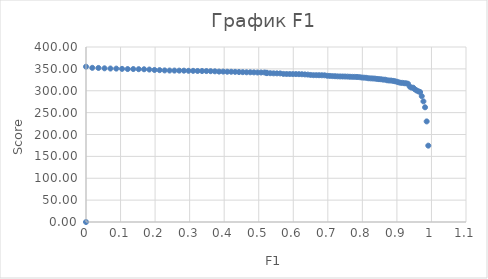
| Category | Column 3 |
|---|---|
| 0.0 | 0 |
| 0.0 | 355 |
| 0.01818181818181818 | 352.4 |
| 0.036036036036036036 | 352.1 |
| 0.05357142857142857 | 351.3 |
| 0.07079646017699115 | 350.8 |
| 0.08771929824561403 | 350.6 |
| 0.10434782608695652 | 350 |
| 0.1206896551724138 | 349.6 |
| 0.13675213675213677 | 349.6 |
| 0.15254237288135594 | 349.3 |
| 0.16806722689075632 | 349.1 |
| 0.18333333333333332 | 348.5 |
| 0.19834710743801653 | 347.5 |
| 0.21311475409836064 | 347.1 |
| 0.22764227642276422 | 346.5 |
| 0.24193548387096775 | 346.2 |
| 0.256 | 346.1 |
| 0.2698412698412698 | 346 |
| 0.28346456692913385 | 345.9 |
| 0.296875 | 345.6 |
| 0.31007751937984496 | 345.5 |
| 0.3230769230769231 | 345.2 |
| 0.33587786259541985 | 345.1 |
| 0.3484848484848485 | 345 |
| 0.3609022556390977 | 344.7 |
| 0.373134328358209 | 344.4 |
| 0.3851851851851852 | 343.8 |
| 0.39705882352941174 | 343.8 |
| 0.40875912408759124 | 343.5 |
| 0.42028985507246375 | 343.4 |
| 0.4316546762589928 | 343.2 |
| 0.44285714285714284 | 342.8 |
| 0.45390070921985815 | 342.5 |
| 0.4647887323943662 | 342.2 |
| 0.4755244755244755 | 342.2 |
| 0.4861111111111111 | 342 |
| 0.496551724137931 | 341.7 |
| 0.5068493150684932 | 341.7 |
| 0.5170068027210885 | 341.7 |
| 0.5234899328859061 | 341.1 |
| 0.5234899328859061 | 340.3 |
| 0.5333333333333333 | 340.1 |
| 0.543046357615894 | 339.8 |
| 0.5526315789473685 | 339.7 |
| 0.5620915032679739 | 339.6 |
| 0.5714285714285714 | 338.5 |
| 0.5806451612903226 | 338.3 |
| 0.5897435897435898 | 338.2 |
| 0.5987261146496815 | 338.1 |
| 0.6075949367088608 | 338.1 |
| 0.6163522012578616 | 337.9 |
| 0.625 | 337.7 |
| 0.6335403726708074 | 337.3 |
| 0.6419753086419753 | 336.9 |
| 0.6503067484662577 | 336.1 |
| 0.6585365853658537 | 335.6 |
| 0.6666666666666666 | 335.6 |
| 0.6746987951807228 | 335.5 |
| 0.6826347305389222 | 335.4 |
| 0.6904761904761905 | 335.3 |
| 0.6982248520710059 | 334.3 |
| 0.7058823529411765 | 333.9 |
| 0.7134502923976608 | 333.5 |
| 0.7209302325581395 | 333.2 |
| 0.7283236994219653 | 332.9 |
| 0.735632183908046 | 332.7 |
| 0.7428571428571429 | 332.6 |
| 0.75 | 332.5 |
| 0.7570621468926554 | 332.3 |
| 0.7640449438202247 | 332 |
| 0.770949720670391 | 331.8 |
| 0.7777777777777778 | 331.7 |
| 0.7845303867403315 | 331.5 |
| 0.7912087912087912 | 331.1 |
| 0.7978142076502732 | 330.3 |
| 0.8043478260869565 | 329.9 |
| 0.8108108108108109 | 329.6 |
| 0.8172043010752689 | 328.6 |
| 0.8235294117647058 | 328.3 |
| 0.8297872340425532 | 328.1 |
| 0.8359788359788359 | 327.8 |
| 0.8421052631578947 | 327.1 |
| 0.8481675392670157 | 326.5 |
| 0.8541666666666666 | 326.2 |
| 0.8601036269430051 | 325.4 |
| 0.865979381443299 | 325.3 |
| 0.8717948717948718 | 323.9 |
| 0.8775510204081632 | 323.4 |
| 0.883248730964467 | 323.3 |
| 0.8888888888888888 | 322.6 |
| 0.8944723618090452 | 321.7 |
| 0.9 | 320.6 |
| 0.9054726368159204 | 319.2 |
| 0.9108910891089109 | 318.2 |
| 0.916256157635468 | 318 |
| 0.9215686274509803 | 317.2 |
| 0.926829268292683 | 317 |
| 0.9320388349514563 | 316 |
| 0.9371980676328503 | 309.4 |
| 0.9423076923076923 | 307.1 |
| 0.9473684210526315 | 306.9 |
| 0.9523809523809523 | 303 |
| 0.957345971563981 | 300.5 |
| 0.9622641509433962 | 298.6 |
| 0.9671361502347418 | 297.1 |
| 0.9719626168224299 | 287.7 |
| 0.9767441860465116 | 275.7 |
| 0.9814814814814815 | 262.2 |
| 0.9861751152073732 | 229.9 |
| 0.9908256880733946 | 174.5 |